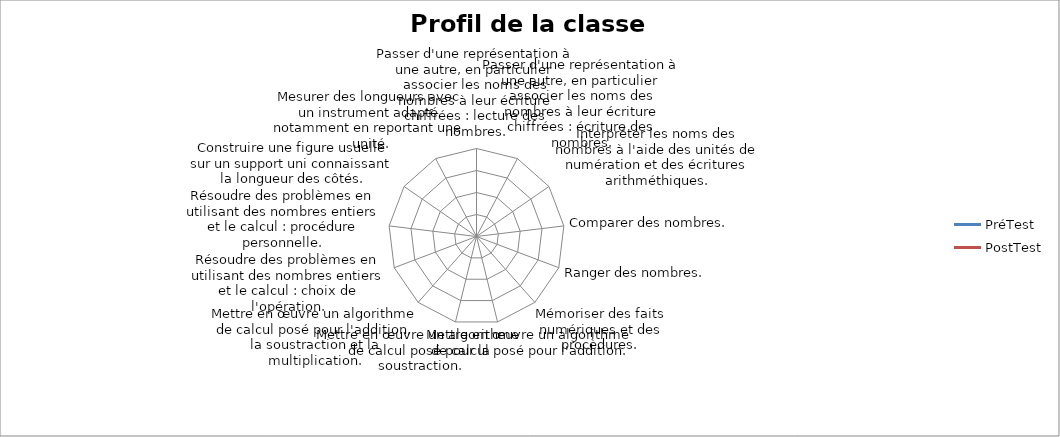
| Category | PréTest | PostTest |
|---|---|---|
| Passer d'une représentation à une autre, en particulier associer les noms des nombres à leur écriture chiffrées : lecture des nombres. | 0 | 0 |
| Passer d'une représentation à une autre, en particulier associer les noms des nombres à leur écriture chiffrées : écriture des nombres. | 0 | 0 |
| Interpréter les noms des nombres à l'aide des unités de numération et des écritures arithméthiques. | 0 | 0 |
| Comparer des nombres. | 0 | 0 |
| Ranger des nombres. | 0 | 0 |
| Mémoriser des faits numériques et des procèdures. | 0 | 0 |
| Mettre en œuvre un algorithme de calcul posé pour l'addition. | 0 | 0 |
| Mettre en œuvre un algorithme de calcul posé pour la soustraction. | 0 | 0 |
| Mettre en œuvre un algorithme de calcul posé pour l'addition, la soustraction et la multiplication. | 0 | 0 |
| Résoudre des problèmes en utilisant des nombres entiers et le calcul : choix de l'opération. | 0 | 0 |
| Résoudre des problèmes en utilisant des nombres entiers et le calcul : procédure personnelle. | 0 | 0 |
| Construire une figure usuelle sur un support uni connaissant la longueur des côtés. | 0 | 0 |
| Mesurer des longueurs avec un instrument adapté notamment en reportant une unité. | 0 | 0 |